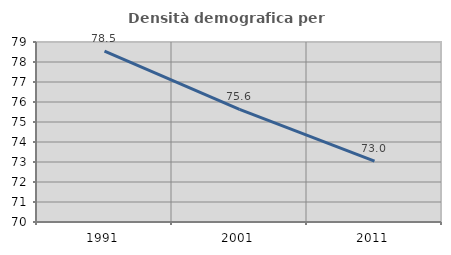
| Category | Densità demografica |
|---|---|
| 1991.0 | 78.542 |
| 2001.0 | 75.636 |
| 2011.0 | 73.045 |